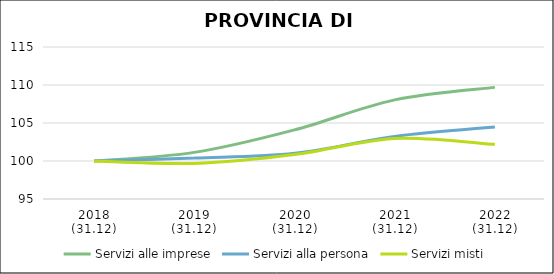
| Category | Servizi alle imprese | Servizi alla persona | Servizi misti |
|---|---|---|---|
| 2018
(31.12) | 100 | 100 | 100 |
| 2019
(31.12) | 101.134 | 100.392 | 99.686 |
| 2020
(31.12) | 104.093 | 101.014 | 100.846 |
| 2021
(31.12) | 108.039 | 103.231 | 102.975 |
| 2022
(31.12) | 109.688 | 104.475 | 102.189 |